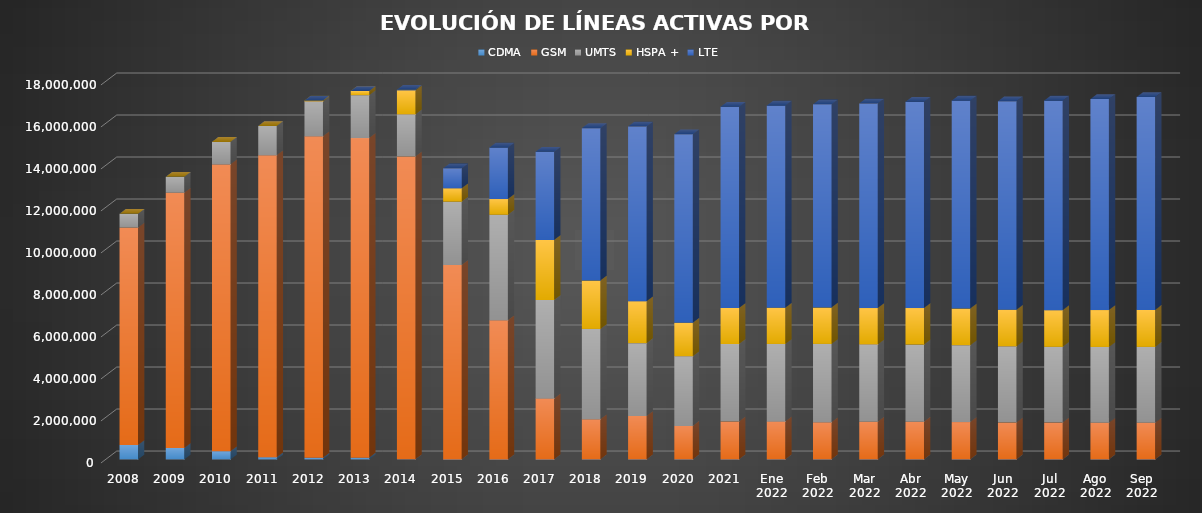
| Category | CDMA | GSM | UMTS | HSPA + | LTE |
|---|---|---|---|---|---|
| 2008 | 688357 | 10346902 | 656989 | 0 | 0 |
| 2009 | 544313 | 12151710 | 758577 | 0 | 0 |
| 2010 | 389834 | 13657394 | 1071603 | 0 | 0 |
| 2011 | 102115 | 14379423 | 1393020 | 0 | 0 |
| 2012 | 75179 | 15310006 | 1658596 | 43082 | 0 |
| 2013 | 83748 | 15215287 | 2043321 | 199398 | 0 |
| 2014 | 3009 | 14418144 | 2006405 | 1148823 | 28176 |
| 2015 | 0 | 9252920 | 3019889 | 636488 | 949723 |
| 2016 | 0 | 6621574 | 5027714 | 748032 | 2450814 |
| 2017 | 0 | 2903370.634 | 4688270.066 | 2852941.199 | 4206822.101 |
| 2018 | 0 | 1909938.891 | 4302462.415 | 2301651 | 7258785.694 |
| 2019 | 0 | 2068130.505 | 3468519.705 | 1995507 | 8320942.79 |
| 2020 | 0 | 1595680.621 | 3315009.099 | 1591073 | 8983603.28 |
| 2021 | 0 | 1804531 | 3688873 | 1717066 | 9579130 |
| Ene 2022 | 0 | 1805568.915 | 3691993.367 | 1724655 | 9625971.718 |
| Feb 2022 | 0 | 1766433.449 | 3732997.987 | 1730603 | 9675803.564 |
| Mar 2022 | 0 | 1788524.686 | 3683797.748 | 1734523 | 9742847.566 |
| Abr 2022 | 0 | 1787551.615 | 3681280.387 | 1738734 | 9820230.999 |
| May 2022 | 0 | 1778055.41 | 3660016.984 | 1744330 | 9902399.607 |
| Jun 2022 | 0 | 1757626.897 | 3624197.892 | 1745386 | 9928728.21 |
| Jul 2022 | 0 | 1753354.905 | 3606713.14 | 1747790 | 9978154.955 |
| Ago 2022 | 0 | 1747992.74 | 3606888.27 | 1755977 | 10044823.989 |
| Sep 2022 | 0 | 1748744.773 | 3608561.42 | 1762387 | 10133940.807 |